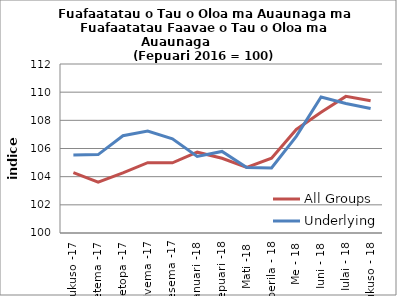
| Category | All Groups | Underlying |
|---|---|---|
| Aukuso -17 | 104.291 | 105.536 |
| Setema -17 | 103.612 | 105.565 |
| Oketopa -17 | 104.27 | 106.905 |
| Nvema -17 | 104.991 | 107.237 |
| Tesema -17 | 104.983 | 106.688 |
| Ianuari -18 | 105.739 | 105.443 |
| Fepuari -18 | 105.308 | 105.79 |
| Mati -18 | 104.655 | 104.651 |
| Aperila - 18 | 105.309 | 104.614 |
| Me - 18 | 107.355 | 106.863 |
| Iuni - 18 | 108.567 | 109.659 |
| Iulai - 18 | 109.702 | 109.198 |
| Aukuso - 18 | 109.392 | 108.845 |